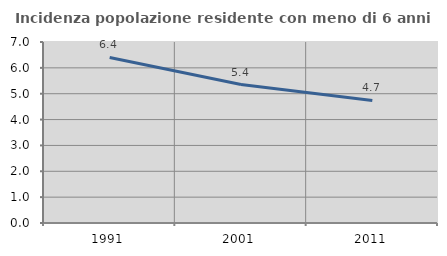
| Category | Incidenza popolazione residente con meno di 6 anni |
|---|---|
| 1991.0 | 6.401 |
| 2001.0 | 5.356 |
| 2011.0 | 4.74 |